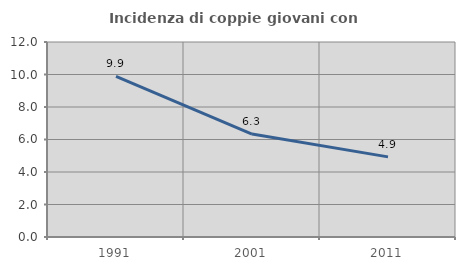
| Category | Incidenza di coppie giovani con figli |
|---|---|
| 1991.0 | 9.882 |
| 2001.0 | 6.333 |
| 2011.0 | 4.93 |